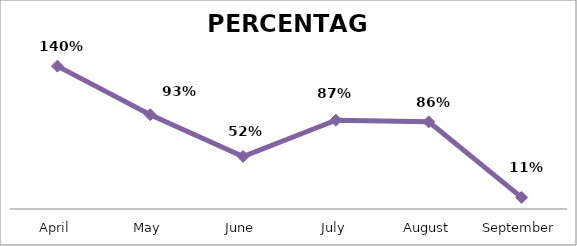
| Category | PERCENTAGE |
|---|---|
| April | 1.402 |
| May | 0.925 |
| June | 0.515 |
| July | 0.872 |
| August | 0.855 |
| September | 0.114 |